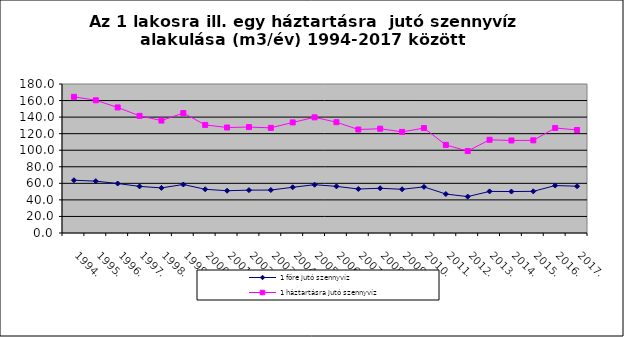
| Category | 1 főre jutó szennyvíz | 1 háztartásra jutó szennyvíz |
|---|---|---|
| 1994. | 63.738 | 164.476 |
| 1995. | 62.64 | 160.361 |
| 1996. | 59.794 | 151.684 |
| 1997. | 56.299 | 141.523 |
| 1998. | 54.484 | 135.837 |
| 1999. | 58.593 | 144.895 |
| 2000. | 52.799 | 130.574 |
| 2001. | 51.062 | 127.445 |
| 2002. | 51.781 | 127.967 |
| 2003. | 51.902 | 127.016 |
| 2004. | 55.207 | 133.593 |
| 2005. | 58.359 | 139.7 |
| 2006. | 56.357 | 133.847 |
| 2007. | 53.148 | 125.018 |
| 2008. | 54.043 | 125.988 |
| 2009. | 52.827 | 122.157 |
| 2010. | 55.713 | 126.72 |
| 2011. | 47.08 | 106.425 |
| 2012. | 43.97 | 98.976 |
| 2013. | 50.249 | 112.596 |
| 2014. | 50.059 | 111.754 |
| 2015. | 50.339 | 111.951 |
| 2016. | 57.34 | 126.879 |
| 2017. | 56.503 | 124.439 |